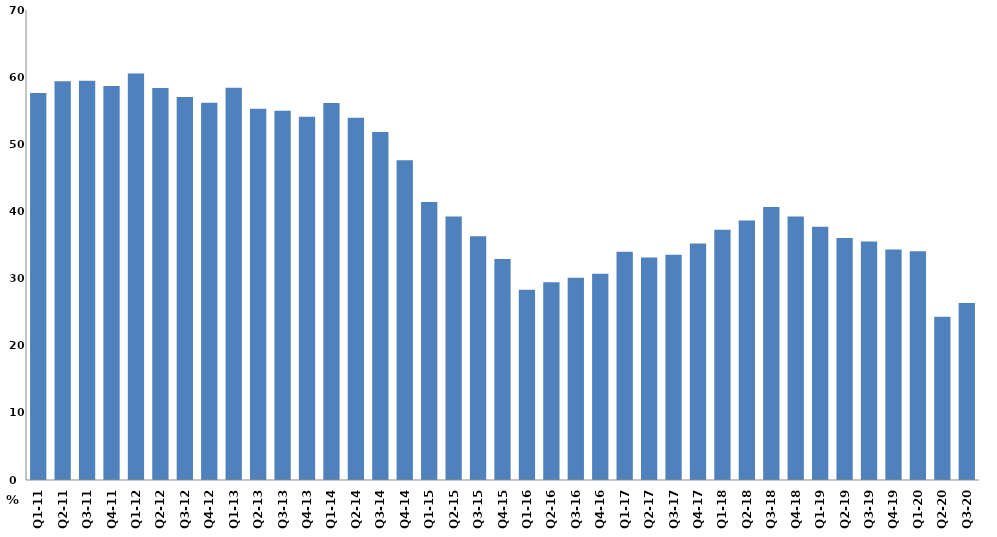
| Category | النسبة المئوية من الناتج المحلي الاجمالي
Percent of Total GDP |
|---|---|
| Q1-11 | 57.631 |
| Q2-11 | 59.399 |
| Q3-11 | 59.453 |
| Q4-11 | 58.671 |
| Q1-12 | 60.56 |
| Q2-12 | 58.396 |
| Q3-12 | 57.038 |
| Q4-12 | 56.204 |
| Q1-13 | 58.424 |
| Q2-13 | 55.307 |
| Q3-13 | 55.006 |
| Q4-13 | 54.088 |
| Q1-14 | 56.163 |
| Q2-14 | 53.956 |
| Q3-14 | 51.811 |
| Q4-14 | 47.617 |
| Q1-15 | 41.418 |
| Q2-15 | 39.238 |
| Q3-15 | 36.285 |
| Q4-15 | 32.901 |
| Q1-16 | 28.334 |
| Q2-16 | 29.447 |
| Q3-16 | 30.13 |
| Q4-16 | 30.707 |
| Q1-17 | 33.991 |
| Q2-17 | 33.157 |
| Q3-17 | 33.536 |
| Q4-17 | 35.228 |
| Q1-18 | 37.277 |
| Q2-18 | 38.632 |
| Q3-18 | 40.658 |
| Q4-18 | 39.257 |
| Q1-19 | 37.717 |
| Q2-19 | 36.027 |
| Q3-19 | 35.507 |
| Q4-19 | 34.33 |
| Q1-20 | 34.068 |
| Q2-20 | 24.326 |
| Q3-20 | 26.358 |